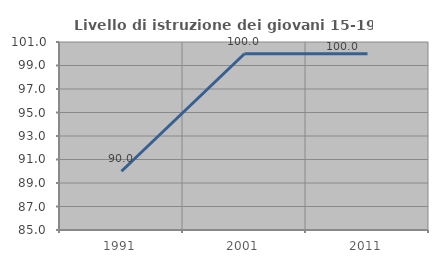
| Category | Livello di istruzione dei giovani 15-19 anni |
|---|---|
| 1991.0 | 90 |
| 2001.0 | 100 |
| 2011.0 | 100 |